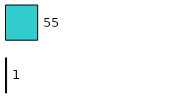
| Category | Series 0 | Series 1 |
|---|---|---|
| 0 | 1 | 55 |